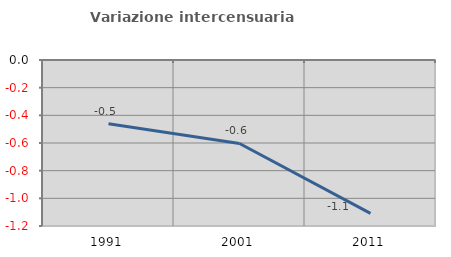
| Category | Variazione intercensuaria annua |
|---|---|
| 1991.0 | -0.46 |
| 2001.0 | -0.603 |
| 2011.0 | -1.109 |